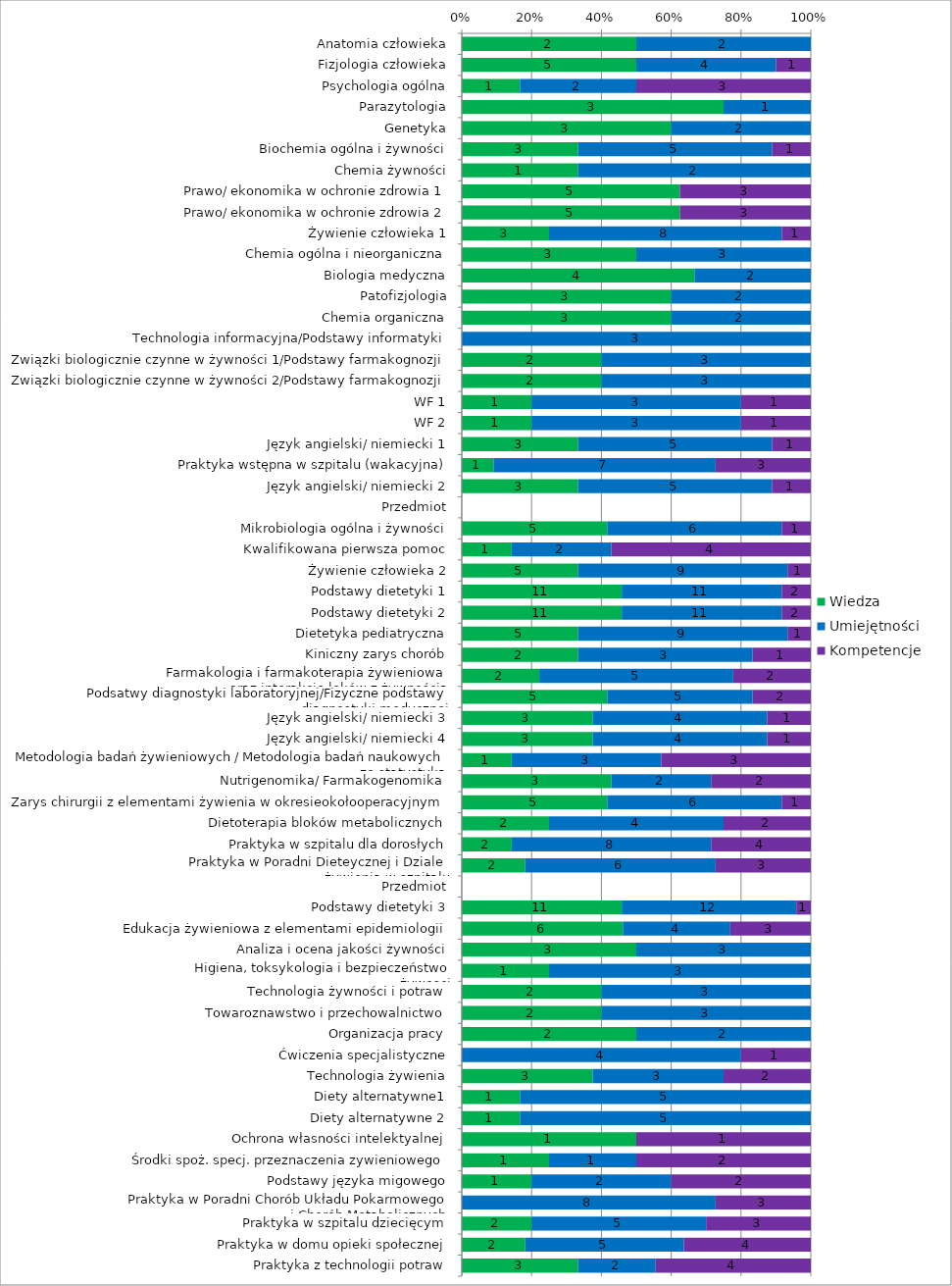
| Category | Wiedza | Umiejętności | Kompetencje |
|---|---|---|---|
| Anatomia człowieka | 2 | 2 | 0 |
| Fizjologia człowieka | 5 | 4 | 1 |
| Psychologia ogólna | 1 | 2 | 3 |
| Parazytologia | 3 | 1 | 0 |
| Genetyka | 3 | 2 | 0 |
| Biochemia ogólna i żywności | 3 | 5 | 1 |
| Chemia żywności | 1 | 2 | 0 |
| Prawo/ ekonomika w ochronie zdrowia 1 | 5 | 0 | 3 |
| Prawo/ ekonomika w ochronie zdrowia 2 | 5 | 0 | 3 |
| Żywienie człowieka 1 | 3 | 8 | 1 |
| Chemia ogólna i nieorganiczna | 3 | 3 | 0 |
| Biologia medyczna | 4 | 2 | 0 |
| Patofizjologia | 3 | 2 | 0 |
| Chemia organiczna | 3 | 2 | 0 |
| Technologia informacyjna/Podstawy informatyki | 0 | 3 | 0 |
| Związki biologicznie czynne w żywności 1/Podstawy farmakognozji | 2 | 3 | 0 |
| Związki biologicznie czynne w żywności 2/Podstawy farmakognozji | 2 | 3 | 0 |
| WF 1 | 1 | 3 | 1 |
| WF 2 | 1 | 3 | 1 |
| Język angielski/ niemiecki 1 | 3 | 5 | 1 |
| Praktyka wstępna w szpitalu (wakacyjna) | 1 | 7 | 3 |
| Język angielski/ niemiecki 2 | 3 | 5 | 1 |
| Przedmiot | 0 | 0 | 0 |
| Mikrobiologia ogólna i żywności | 5 | 6 | 1 |
| Kwalifikowana pierwsza pomoc | 1 | 2 | 4 |
| Żywienie człowieka 2 | 5 | 9 | 1 |
| Podstawy dietetyki 1 | 11 | 11 | 2 |
| Podstawy dietetyki 2 | 11 | 11 | 2 |
| Dietetyka pediatryczna | 5 | 9 | 1 |
| Kiniczny zarys chorób | 2 | 3 | 1 |
| Farmakologia i farmakoterapia żywieniowa 
oraz interakcje leków z żywnością | 2 | 5 | 2 |
| Podsatwy diagnostyki laboratoryjnej/Fizyczne podstawy diagnostyki medycznej | 5 | 5 | 2 |
| Język angielski/ niemiecki 3 | 3 | 4 | 1 |
| Język angielski/ niemiecki 4 | 3 | 4 | 1 |
| Metodologia badań żywieniowych / Metodologia badań naukowych ze statystyką  | 1 | 3 | 3 |
| Nutrigenomika/ Farmakogenomika | 3 | 2 | 2 |
| Zarys chirurgii z elementami żywienia w okresieokołooperacyjnym | 5 | 6 | 1 |
| Dietoterapia bloków metabolicznych | 2 | 4 | 2 |
| Praktyka w szpitalu dla dorosłych | 2 | 8 | 4 |
| Praktyka w Poradni Dieteycznej i Dziale 
żywienia w szpitalu | 2 | 6 | 3 |
| Przedmiot | 0 | 0 | 0 |
| Podstawy dietetyki 3 | 11 | 12 | 1 |
| Edukacja żywieniowa z elementami epidemiologii | 6 | 4 | 3 |
| Analiza i ocena jakości żywności | 3 | 3 | 0 |
| Higiena, toksykologia i bezpieczeństwo
żywosci | 1 | 3 | 0 |
| Technologia żywności i potraw | 2 | 3 | 0 |
| Towaroznawstwo i przechowalnictwo | 2 | 3 | 0 |
| Organizacja pracy | 2 | 2 | 0 |
| Ćwiczenia specjalistyczne | 0 | 4 | 1 |
| Technologia żywienia | 3 | 3 | 2 |
| Diety alternatywne1 | 1 | 5 | 0 |
| Diety alternatywne 2 | 1 | 5 | 0 |
| Ochrona własności intelektyalnej | 1 | 0 | 1 |
| Środki spoż. specj. przeznaczenia zywieniowego | 1 | 1 | 2 |
| Podstawy języka migowego | 1 | 2 | 2 |
| Praktyka w Poradni Chorób Układu Pokarmowego
i Chorób Metabolicznych | 0 | 8 | 3 |
| Praktyka w szpitalu dziecięcym | 2 | 5 | 3 |
| Praktyka w domu opieki społecznej | 2 | 5 | 4 |
| Praktyka z technologii potraw | 3 | 2 | 4 |